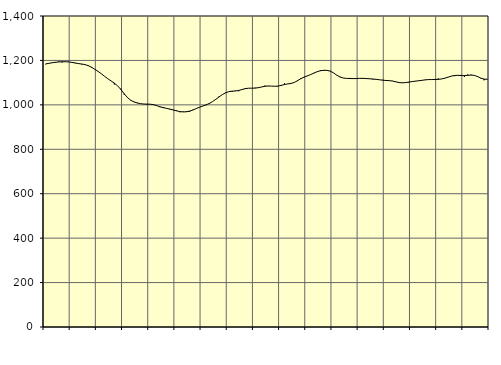
| Category | Piggar | Series 1 |
|---|---|---|
| nan | 1182.7 | 1184.3 |
| 87.0 | 1187.1 | 1186.91 |
| 87.0 | 1188.6 | 1189.51 |
| 87.0 | 1190 | 1191.73 |
| nan | 1195.5 | 1193.1 |
| 88.0 | 1191 | 1193.93 |
| 88.0 | 1195.1 | 1194.16 |
| 88.0 | 1194.6 | 1193.26 |
| nan | 1190.3 | 1191.18 |
| 89.0 | 1189.7 | 1188.4 |
| 89.0 | 1187.2 | 1185.95 |
| 89.0 | 1182.1 | 1183.97 |
| nan | 1182.1 | 1181.3 |
| 90.0 | 1178 | 1176.63 |
| 90.0 | 1167.8 | 1169.41 |
| 90.0 | 1160.9 | 1160.57 |
| nan | 1151.1 | 1150.93 |
| 91.0 | 1140.4 | 1140.17 |
| 91.0 | 1128.3 | 1128.62 |
| 91.0 | 1117.7 | 1117.67 |
| nan | 1107.9 | 1107.63 |
| 92.0 | 1091.7 | 1097.76 |
| 92.0 | 1085.5 | 1085.55 |
| 92.0 | 1072.7 | 1069.04 |
| nan | 1046.5 | 1050.15 |
| 93.0 | 1031.4 | 1032.95 |
| 93.0 | 1021.9 | 1020.77 |
| 93.0 | 1014.2 | 1013.25 |
| nan | 1009.7 | 1008.35 |
| 94.0 | 1005.3 | 1005.34 |
| 94.0 | 1003.9 | 1003.71 |
| 94.0 | 1000.7 | 1003.3 |
| nan | 1002.6 | 1002.94 |
| 95.0 | 1001.9 | 1000.74 |
| 95.0 | 995.6 | 996.22 |
| 95.0 | 989.8 | 991.1 |
| nan | 990.3 | 987.2 |
| 96.0 | 984.4 | 984.09 |
| 96.0 | 979.5 | 980.89 |
| 96.0 | 976.2 | 977.15 |
| nan | 975.5 | 973.08 |
| 97.0 | 966.6 | 969.76 |
| 97.0 | 969.9 | 968.24 |
| 97.0 | 971 | 968.88 |
| nan | 968 | 971.73 |
| 98.0 | 978 | 976.62 |
| 98.0 | 982.7 | 983.06 |
| 98.0 | 988.5 | 989.1 |
| nan | 994.9 | 994.37 |
| 99.0 | 998.6 | 999.72 |
| 99.0 | 1004.2 | 1006.1 |
| 99.0 | 1014.6 | 1014.71 |
| nan | 1025.8 | 1025.08 |
| 0.0 | 1038.1 | 1035.8 |
| 0.0 | 1045.5 | 1046.03 |
| 0.0 | 1055.7 | 1054.19 |
| nan | 1059.8 | 1059.46 |
| 1.0 | 1059.5 | 1061.69 |
| 1.0 | 1063.8 | 1062.46 |
| 1.0 | 1061.3 | 1064.74 |
| nan | 1069.3 | 1068.95 |
| 2.0 | 1075.1 | 1072.89 |
| 2.0 | 1074.7 | 1074.9 |
| 2.0 | 1075.2 | 1075.07 |
| nan | 1077.1 | 1075.33 |
| 3.0 | 1075.8 | 1077.33 |
| 3.0 | 1080.2 | 1080.51 |
| 3.0 | 1086.6 | 1083.68 |
| nan | 1084.2 | 1085.03 |
| 4.0 | 1084.2 | 1084.39 |
| 4.0 | 1083.2 | 1083.67 |
| 4.0 | 1083.6 | 1084.53 |
| nan | 1084.9 | 1087.72 |
| 5.0 | 1096.6 | 1091.55 |
| 5.0 | 1094.6 | 1094.23 |
| 5.0 | 1095.6 | 1096.4 |
| nan | 1100.4 | 1100.92 |
| 6.0 | 1107.1 | 1109 |
| 6.0 | 1120 | 1117.81 |
| 6.0 | 1123.6 | 1124.95 |
| nan | 1129.6 | 1130.61 |
| 7.0 | 1137.1 | 1136.42 |
| 7.0 | 1142.4 | 1143.25 |
| 7.0 | 1150.5 | 1149.44 |
| nan | 1156.5 | 1153.62 |
| 8.0 | 1153.1 | 1155.58 |
| 8.0 | 1156.1 | 1155.31 |
| 8.0 | 1152.8 | 1151.64 |
| nan | 1143.5 | 1143.81 |
| 9.0 | 1134.2 | 1133.49 |
| 9.0 | 1126.5 | 1125.25 |
| 9.0 | 1120.4 | 1120.73 |
| nan | 1119.2 | 1119.13 |
| 10.0 | 1121.2 | 1118.52 |
| 10.0 | 1116.4 | 1118.18 |
| 10.0 | 1117.8 | 1118.57 |
| nan | 1119.7 | 1119.34 |
| 11.0 | 1119.5 | 1119.33 |
| 11.0 | 1119.6 | 1118.42 |
| 11.0 | 1116.4 | 1117.44 |
| nan | 1114.1 | 1116.38 |
| 12.0 | 1114.2 | 1114.8 |
| 12.0 | 1112.2 | 1112.93 |
| 12.0 | 1112.9 | 1111.04 |
| nan | 1108.9 | 1109.79 |
| 13.0 | 1108.9 | 1109.09 |
| 13.0 | 1108 | 1107.31 |
| 13.0 | 1105 | 1103.8 |
| nan | 1100.5 | 1100.35 |
| 14.0 | 1098.3 | 1099.13 |
| 14.0 | 1101.3 | 1100.28 |
| 14.0 | 1100.3 | 1102.48 |
| nan | 1104.6 | 1104.77 |
| 15.0 | 1107.5 | 1106.71 |
| 15.0 | 1107.4 | 1108.44 |
| 15.0 | 1110.6 | 1110.36 |
| nan | 1111.5 | 1112.6 |
| 16.0 | 1114.8 | 1113.79 |
| 16.0 | 1114.6 | 1113.96 |
| 16.0 | 1112.1 | 1114.14 |
| nan | 1119 | 1114.79 |
| 17.0 | 1116.7 | 1116.6 |
| 17.0 | 1120.9 | 1120.07 |
| 17.0 | 1124.4 | 1124.83 |
| nan | 1128.8 | 1129.35 |
| 18.0 | 1129.1 | 1132.34 |
| 18.0 | 1132.1 | 1132.93 |
| 18.0 | 1135 | 1131.9 |
| nan | 1125.8 | 1131.53 |
| 19.0 | 1136.8 | 1132.8 |
| 19.0 | 1135.9 | 1134.13 |
| 19.0 | 1133.3 | 1132.68 |
| nan | 1129.3 | 1127.38 |
| 20.0 | 1119 | 1120.56 |
| 20.0 | 1110.8 | 1115.87 |
| 20.0 | 1116.6 | 1115.27 |